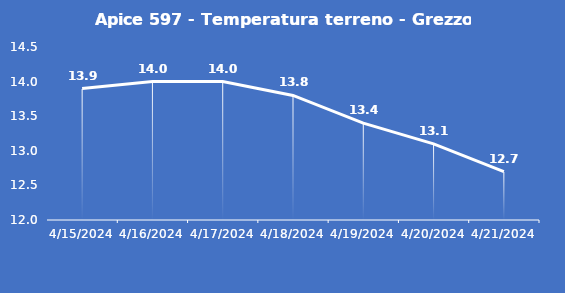
| Category | Apice 597 - Temperatura terreno - Grezzo (°C) |
|---|---|
| 4/15/24 | 13.9 |
| 4/16/24 | 14 |
| 4/17/24 | 14 |
| 4/18/24 | 13.8 |
| 4/19/24 | 13.4 |
| 4/20/24 | 13.1 |
| 4/21/24 | 12.7 |